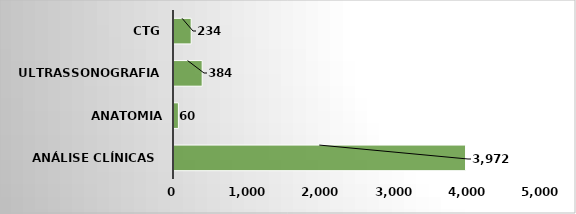
| Category | Series 0 |
|---|---|
| Análise Clínicas  | 3972 |
| Anatomia Patológica | 60 |
| Ultrassonografia  | 384 |
| CTG | 234 |